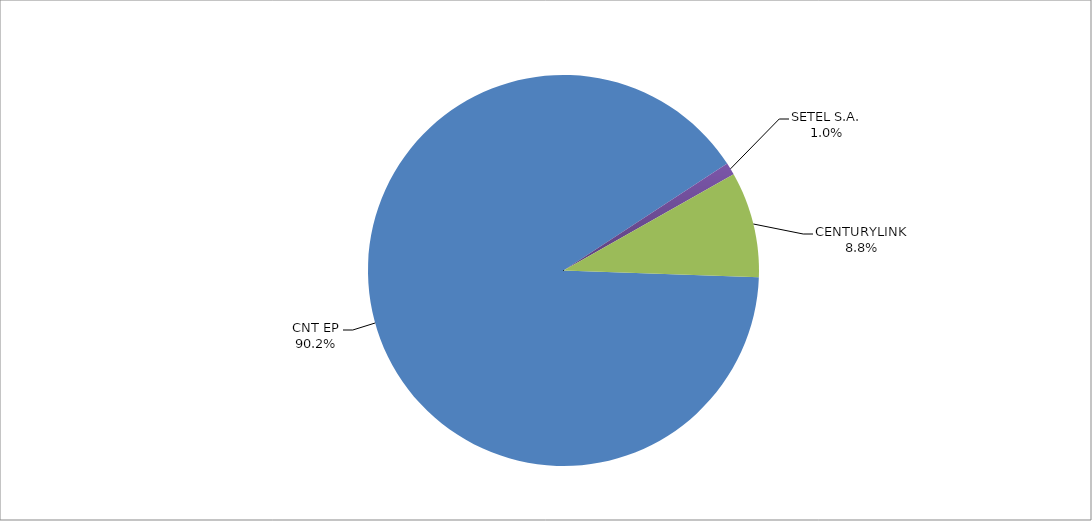
| Category | Series 0 |
|---|---|
| CNT EP | 268 |
| SETEL S.A. | 3 |
| CENTURYLINK | 26 |